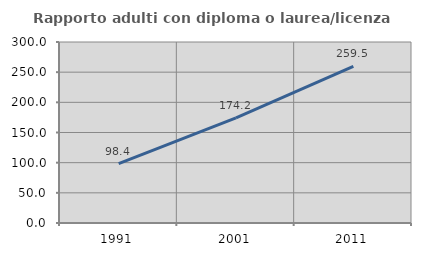
| Category | Rapporto adulti con diploma o laurea/licenza media  |
|---|---|
| 1991.0 | 98.374 |
| 2001.0 | 174.247 |
| 2011.0 | 259.464 |